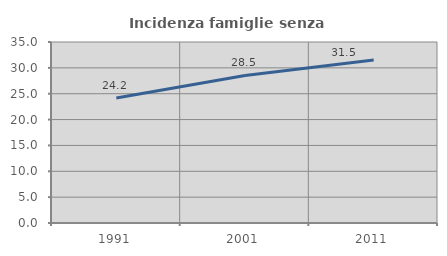
| Category | Incidenza famiglie senza nuclei |
|---|---|
| 1991.0 | 24.16 |
| 2001.0 | 28.531 |
| 2011.0 | 31.523 |